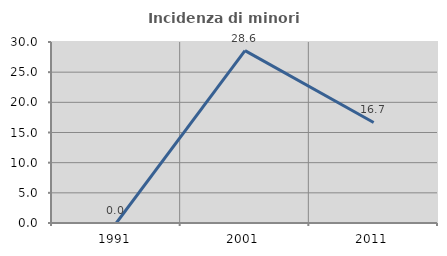
| Category | Incidenza di minori stranieri |
|---|---|
| 1991.0 | 0 |
| 2001.0 | 28.571 |
| 2011.0 | 16.667 |